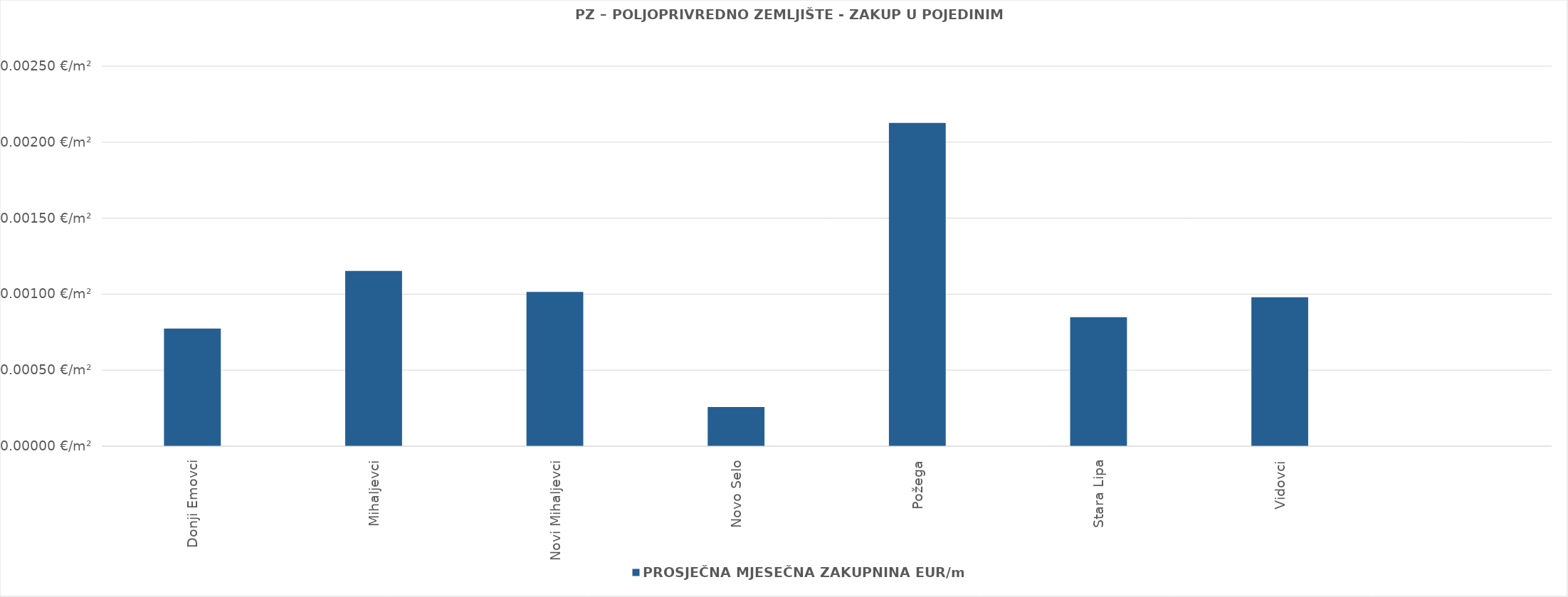
| Category | PROSJEČNA MJESEČNA ZAKUPNINA EUR/m² |
|---|---|
| Donji Emovci | 0.001 |
| Mihaljevci | 0.001 |
| Novi Mihaljevci | 0.001 |
| Novo Selo | 0 |
| Požega | 0.002 |
| Stara Lipa | 0.001 |
| Vidovci | 0.001 |